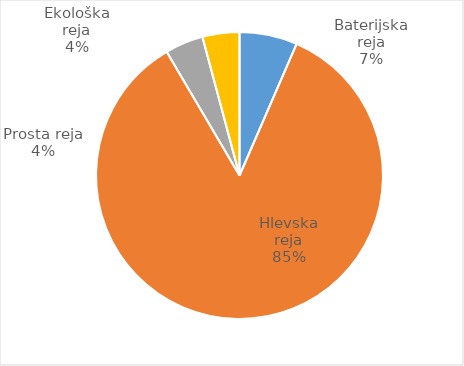
| Category | Število kosov jajc |
|---|---|
| Baterijska reja | 229599 |
| Hlevska reja | 2995046 |
| Prosta reja | 151917 |
| Ekološka reja | 146520 |